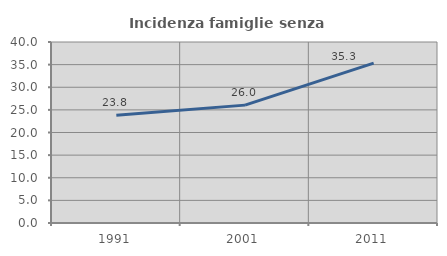
| Category | Incidenza famiglie senza nuclei |
|---|---|
| 1991.0 | 23.829 |
| 2001.0 | 26.05 |
| 2011.0 | 35.324 |